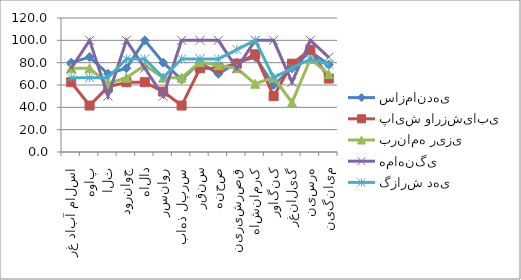
| Category | سازماندهی | پایش وارزشیابی | برنامه ریزی  | هماهنگی | گزارش دهی |
|---|---|---|---|---|---|
| اسلام آباد غرب | 80 | 62.5 | 75 | 75 | 66.6 |
| پاوه | 85 | 41.6 | 75 | 100 | 66.6 |
| ثلاث | 70 | 58.3 | 61.1 | 50 | 66.6 |
| جوانرود | 75 | 62.5 | 66.5 | 100 | 83.3 |
| دالاهو | 100 | 62.5 | 77.7 | 75 | 83.3 |
| روانسر | 80 | 54.1 | 66.6 | 50 | 66.6 |
| سرپل ذهاب | 65 | 41.6 | 66.6 | 100 | 83.3 |
| سنقر | 80 | 75 | 80.5 | 100 | 83.3 |
| صحنه | 70 | 75 | 77.7 | 100 | 83.3 |
| قصرشیرین | 80 | 79.1 | 75 | 75 | 91.6 |
| کرمانشاه | 85 | 87.5 | 61.1 | 100 | 100 |
| کنگاور | 60 | 50 | 66.6 | 100 | 66.6 |
| گیلانغرب | 75 | 79.1 | 44.4 | 62.5 | 75 |
| هرسین | 90 | 91.6 | 83.3 | 100 | 83.3 |
| میانگین | 78.214 | 65.743 | 69.793 | 84.821 | 78.529 |